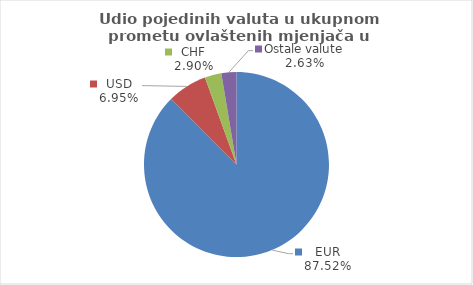
| Category | Series 0 |
|---|---|
| EUR | 87.518 |
| USD | 6.947 |
| CHF | 2.904 |
| Ostale valute | 2.631 |